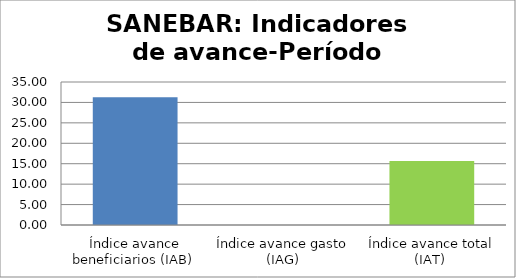
| Category | Series 0 |
|---|---|
| Índice avance beneficiarios (IAB)  | 31.271 |
| Índice avance gasto (IAG) | 0 |
| Índice avance total (IAT)  | 15.635 |